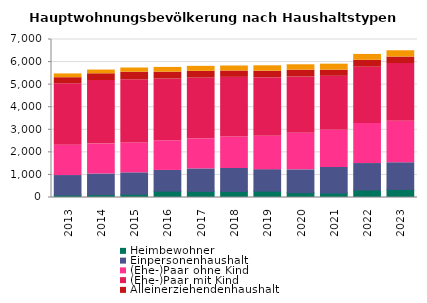
| Category | Heimbewohner | Einpersonenhaushalt | (Ehe-)Paar ohne Kind | (Ehe-)Paar mit Kind | Alleinerziehendenhaushalt | sonstiger Mehrpersonenhaushalt |
|---|---|---|---|---|---|---|
| 2013.0 | 104 | 869 | 1343 | 2723 | 269 | 167 |
| 2014.0 | 125 | 917 | 1325 | 2813 | 302 | 164 |
| 2015.0 | 143 | 950 | 1325 | 2798 | 335 | 185 |
| 2016.0 | 281 | 917 | 1316 | 2729 | 311 | 209 |
| 2017.0 | 272 | 995 | 1334 | 2690 | 299 | 221 |
| 2018.0 | 269 | 1016 | 1397 | 2639 | 284 | 221 |
| 2019.0 | 281 | 953 | 1475 | 2600 | 287 | 239 |
| 2020.0 | 212 | 1013 | 1622 | 2492 | 302 | 239 |
| 2021.0 | 197 | 1133 | 1652 | 2387 | 272 | 266 |
| 2022.0 | 332 | 1172 | 1778 | 2489 | 308 | 260 |
| 2023.0 | 356 | 1184 | 1835 | 2558 | 290 | 278 |